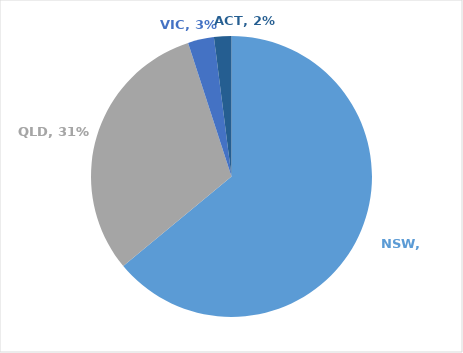
| Category | Series 0 |
|---|---|
| NSW | 0.64 |
| QLD | 0.31 |
| VIC | 0.03 |
| ACT | 0.02 |